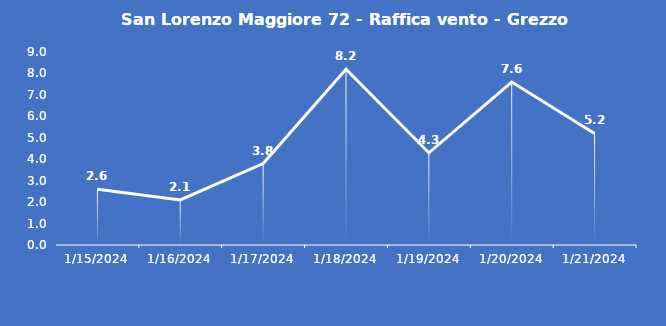
| Category | San Lorenzo Maggiore 72 - Raffica vento - Grezzo (m/s) |
|---|---|
| 1/15/24 | 2.6 |
| 1/16/24 | 2.1 |
| 1/17/24 | 3.8 |
| 1/18/24 | 8.2 |
| 1/19/24 | 4.3 |
| 1/20/24 | 7.6 |
| 1/21/24 | 5.2 |